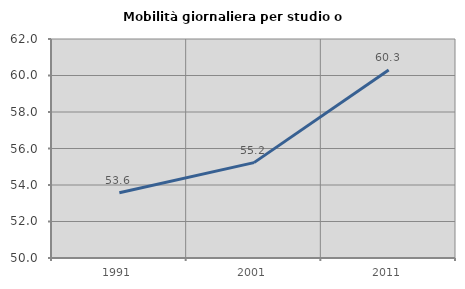
| Category | Mobilità giornaliera per studio o lavoro |
|---|---|
| 1991.0 | 53.576 |
| 2001.0 | 55.226 |
| 2011.0 | 60.306 |